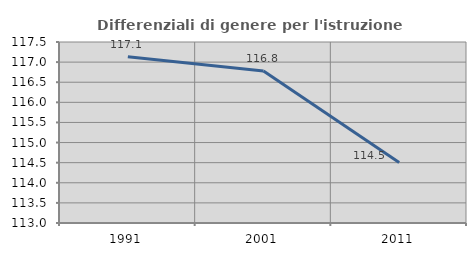
| Category | Differenziali di genere per l'istruzione superiore |
|---|---|
| 1991.0 | 117.135 |
| 2001.0 | 116.78 |
| 2011.0 | 114.505 |